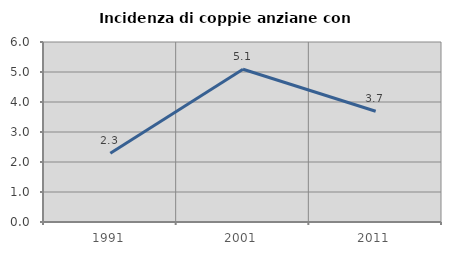
| Category | Incidenza di coppie anziane con figli |
|---|---|
| 1991.0 | 2.29 |
| 2001.0 | 5.091 |
| 2011.0 | 3.69 |